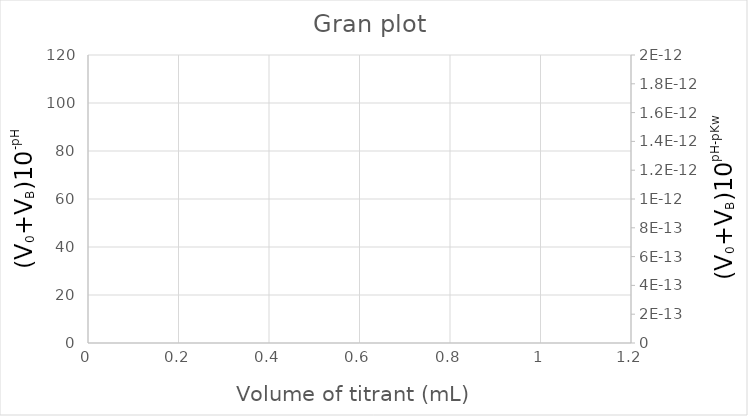
| Category | Series 0 |
|---|---|
|  | 100 |
|  | 100 |
|  | 100 |
|  | 100 |
|  | 100 |
|  | 100 |
|  | 100 |
|  | 100 |
|  | 100 |
|  | 100 |
|  | 100 |
|  | 100 |
|  | 100 |